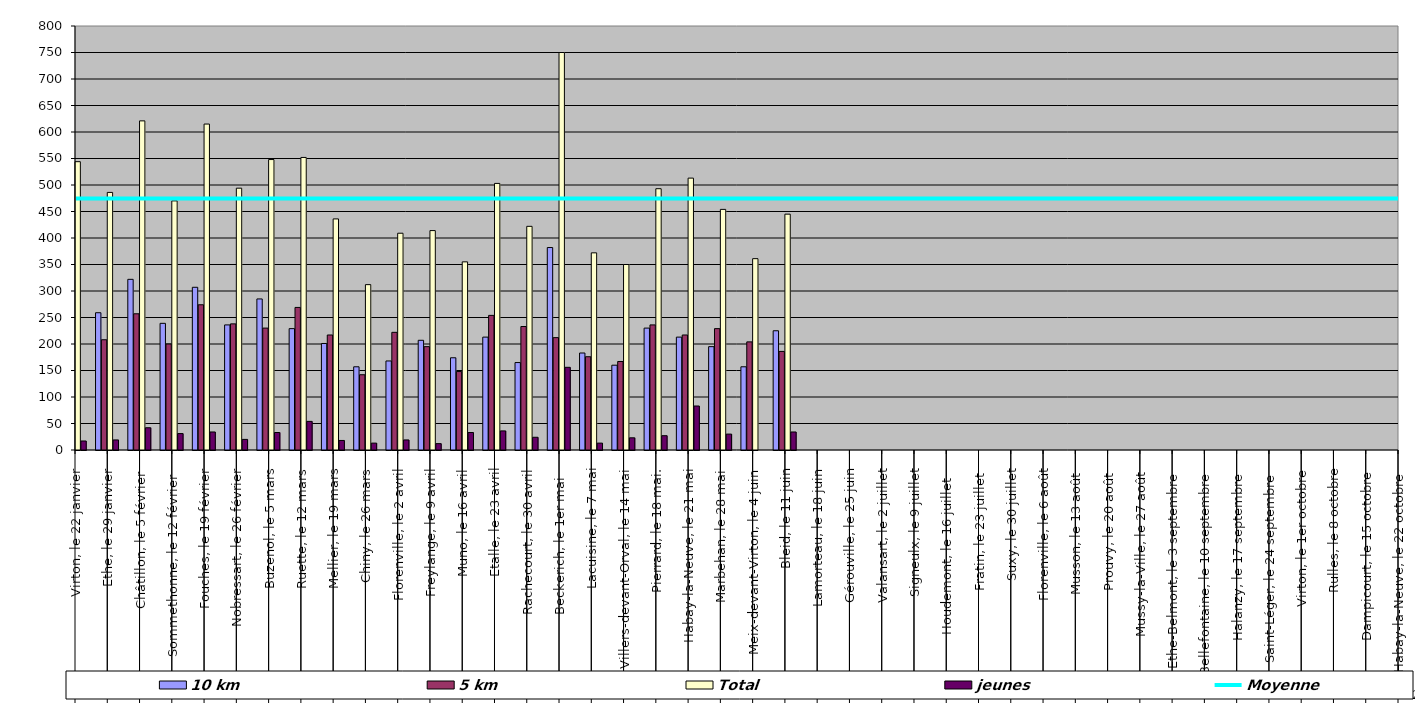
| Category | 10 km | 5 km | Total | jeunes |
|---|---|---|---|---|
| 0 | 296 | 231 | 544 | 17 |
| 1 | 259 | 208 | 486 | 19 |
| 2 | 322 | 257 | 621 | 42 |
| 3 | 239 | 200 | 470 | 31 |
| 4 | 307 | 274 | 615 | 34 |
| 5 | 236 | 238 | 494 | 20 |
| 6 | 285 | 230 | 548 | 33 |
| 7 | 229 | 269 | 552 | 54 |
| 8 | 201 | 217 | 436 | 18 |
| 9 | 157 | 142 | 312 | 13 |
| 10 | 168 | 222 | 409 | 19 |
| 11 | 207 | 195 | 414 | 12 |
| 12 | 174 | 148 | 355 | 33 |
| 13 | 213 | 254 | 503 | 36 |
| 14 | 165 | 233 | 422 | 24 |
| 15 | 382 | 212 | 750 | 156 |
| 16 | 183 | 176 | 372 | 13 |
| 17 | 160 | 167 | 350 | 23 |
| 18 | 230 | 236 | 493 | 27 |
| 19 | 213 | 217 | 513 | 83 |
| 20 | 195 | 229 | 454 | 30 |
| 21 | 157 | 204 | 361 | 0 |
| 22 | 225 | 186 | 445 | 34 |
| 23 | 0 | 0 | 0 | 0 |
| 24 | 0 | 0 | 0 | 0 |
| 25 | 0 | 0 | 0 | 0 |
| 26 | 0 | 0 | 0 | 0 |
| 27 | 0 | 0 | 0 | 0 |
| 28 | 0 | 0 | 0 | 0 |
| 29 | 0 | 0 | 0 | 0 |
| 30 | 0 | 0 | 0 | 0 |
| 31 | 0 | 0 | 0 | 0 |
| 32 | 0 | 0 | 0 | 0 |
| 33 | 0 | 0 | 0 | 0 |
| 34 | 0 | 0 | 0 | 0 |
| 35 | 0 | 0 | 0 | 0 |
| 36 | 0 | 0 | 0 | 0 |
| 37 | 0 | 0 | 0 | 0 |
| 38 | 0 | 0 | 0 | 0 |
| 39 | 0 | 0 | 0 | 0 |
| 40 | 0 | 0 | 0 | 0 |
| 41 | 0 | 0 | 0 | 0 |